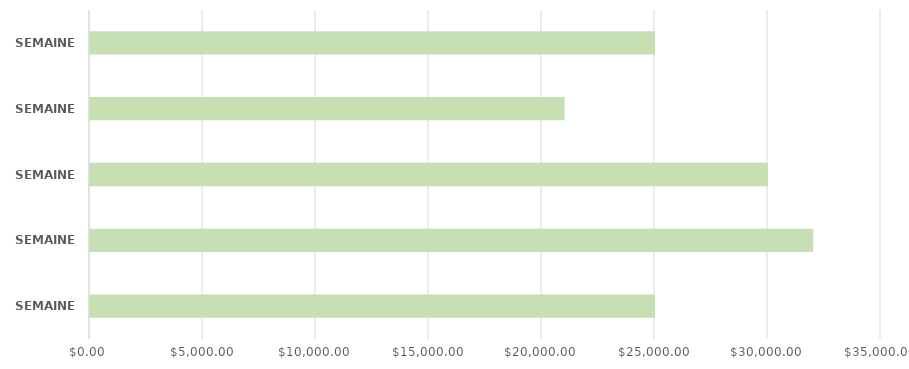
| Category | Series 0 |
|---|---|
| SEMAINE 1 | 25000 |
| SEMAINE 2 | 32000 |
| SEMAINE 3 | 30000 |
| SEMAINE 4 | 21000 |
| SEMAINE 5 | 25000 |